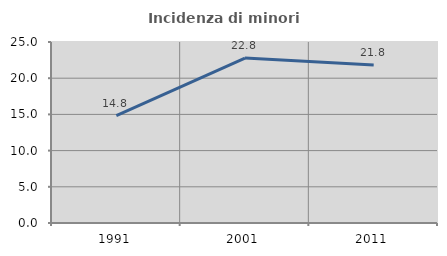
| Category | Incidenza di minori stranieri |
|---|---|
| 1991.0 | 14.841 |
| 2001.0 | 22.782 |
| 2011.0 | 21.823 |